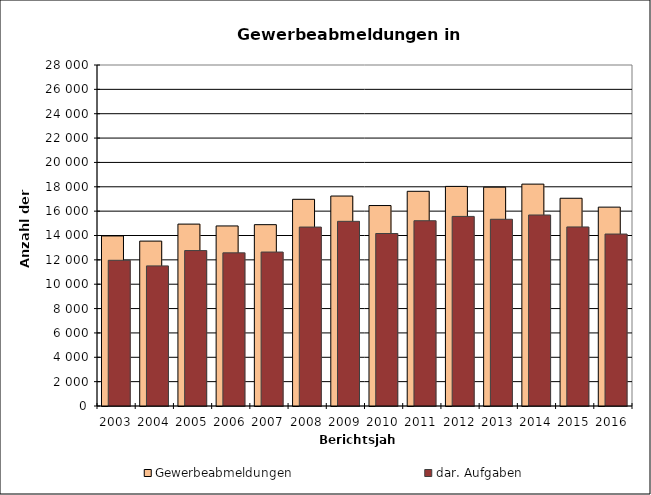
| Category | Gewerbeabmeldungen | dar. Aufgaben |
|---|---|---|
| 2003.0 | 13964 | 11965 |
| 2004.0 | 13540 | 11504 |
| 2005.0 | 14936 | 12763 |
| 2006.0 | 14785 | 12576 |
| 2007.0 | 14890 | 12642 |
| 2008.0 | 16972 | 14693 |
| 2009.0 | 17240 | 15163 |
| 2010.0 | 16460 | 14163 |
| 2011.0 | 17629 | 15213 |
| 2012.0 | 18032 | 15567 |
| 2013.0 | 17968 | 15333 |
| 2014.0 | 18219 | 15684 |
| 2015.0 | 17058 | 14703 |
| 2016.0 | 16329 | 14120 |